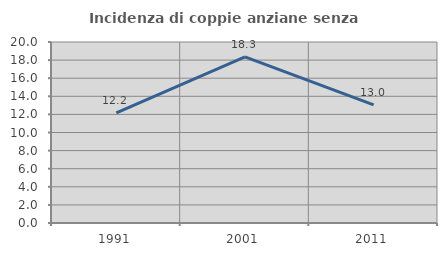
| Category | Incidenza di coppie anziane senza figli  |
|---|---|
| 1991.0 | 12.174 |
| 2001.0 | 18.349 |
| 2011.0 | 13.043 |